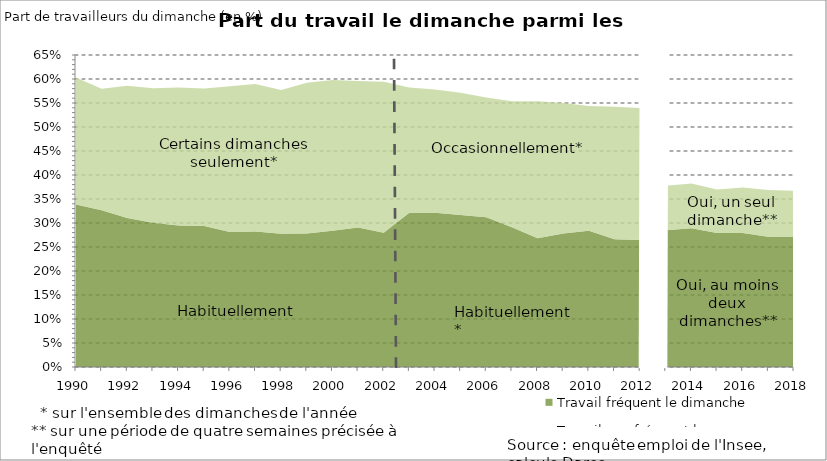
| Category | Travail fréquent le dimanche | Travail peu fréquent le dimanche |
|---|---|---|
| 1990.0 | 0.339 | 0.264 |
| 1991.0 | 0.327 | 0.253 |
| 1992.0 | 0.31 | 0.276 |
| 1993.0 | 0.301 | 0.28 |
| 1994.0 | 0.295 | 0.287 |
| 1995.0 | 0.294 | 0.286 |
| 1996.0 | 0.281 | 0.304 |
| 1997.0 | 0.282 | 0.307 |
| 1998.0 | 0.278 | 0.3 |
| 1999.0 | 0.278 | 0.314 |
| 2000.0 | 0.284 | 0.314 |
| 2001.0 | 0.291 | 0.305 |
| 2002.0 | 0.28 | 0.315 |
| 2003.0 | 0.321 | 0.261 |
| 2004.0 | 0.321 | 0.256 |
| 2005.0 | 0.317 | 0.255 |
| 2006.0 | 0.312 | 0.249 |
| 2007.0 | 0.291 | 0.263 |
| 2008.0 | 0.268 | 0.286 |
| 2009.0 | 0.278 | 0.272 |
| 2010.0 | 0.284 | 0.26 |
| 2011.0 | 0.266 | 0.276 |
| 2012.0 | 0.265 | 0.275 |
| 2013.0 | 0.285 | 0.092 |
| 2014.0 | 0.289 | 0.093 |
| 2015.0 | 0.279 | 0.09 |
| 2016.0 | 0.279 | 0.095 |
| 2017.0 | 0.271 | 0.098 |
| 2018.0 | 0.272 | 0.096 |